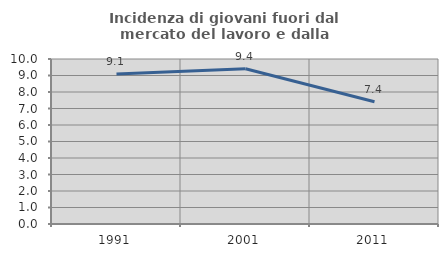
| Category | Incidenza di giovani fuori dal mercato del lavoro e dalla formazione  |
|---|---|
| 1991.0 | 9.091 |
| 2001.0 | 9.412 |
| 2011.0 | 7.407 |